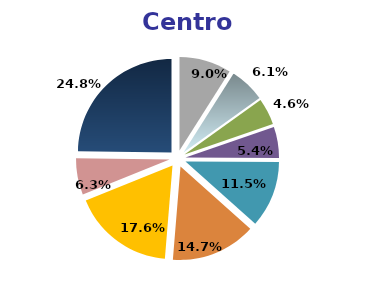
| Category | Centro |
|---|---|
| Agricoltura | 9 |
| Industria in senso stretto | 6.1 |
| Costruzioni | 4.6 |
| Commercio e riparazioni | 5.4 |
| Alberghi e ristoranti | 11.5 |
| Trasporti, comunicazioni etc. | 14.7 |
| P.A., istruzione e sanità | 17.6 |
| Attività svolte da famiglie e convivenze | 6.3 |
| Altri servizi pubblici, sociali e personali | 24.8 |